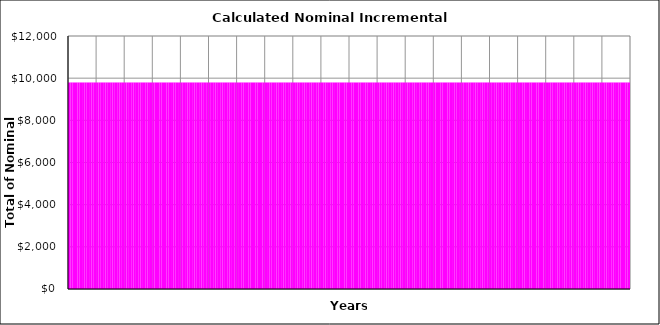
| Category | Stage (1) | Stage (2) | Stage (3) | Stage (4) | Stage (5) | Stage (6) | Stage (7) | Stage (8) | Stage (9) | Stage (10) |
|---|---|---|---|---|---|---|---|---|---|---|
| 0 | 9795.833 | 0 | 0 | 0 | 0 | 0 | 0 | 0 | 0 | 0 |
| 1 | 9795.833 | 0 | 0 | 0 | 0 | 0 | 0 | 0 | 0 | 0 |
| 2 | 9795.833 | 0 | 0 | 0 | 0 | 0 | 0 | 0 | 0 | 0 |
| 3 | 9795.833 | 0 | 0 | 0 | 0 | 0 | 0 | 0 | 0 | 0 |
| 4 | 9795.833 | 0 | 0 | 0 | 0 | 0 | 0 | 0 | 0 | 0 |
| 5 | 9795.833 | 0 | 0 | 0 | 0 | 0 | 0 | 0 | 0 | 0 |
| 6 | 9795.833 | 0 | 0 | 0 | 0 | 0 | 0 | 0 | 0 | 0 |
| 7 | 9795.833 | 0 | 0 | 0 | 0 | 0 | 0 | 0 | 0 | 0 |
| 8 | 9795.833 | 0 | 0 | 0 | 0 | 0 | 0 | 0 | 0 | 0 |
| 9 | 9795.833 | 0 | 0 | 0 | 0 | 0 | 0 | 0 | 0 | 0 |
| 10 | 9795.833 | 0 | 0 | 0 | 0 | 0 | 0 | 0 | 0 | 0 |
| 11 | 9795.833 | 0 | 0 | 0 | 0 | 0 | 0 | 0 | 0 | 0 |
| 12 | 9795.833 | 0 | 0 | 0 | 0 | 0 | 0 | 0 | 0 | 0 |
| 13 | 9795.833 | 0 | 0 | 0 | 0 | 0 | 0 | 0 | 0 | 0 |
| 14 | 9795.833 | 0 | 0 | 0 | 0 | 0 | 0 | 0 | 0 | 0 |
| 15 | 9795.833 | 0 | 0 | 0 | 0 | 0 | 0 | 0 | 0 | 0 |
| 16 | 9795.833 | 0 | 0 | 0 | 0 | 0 | 0 | 0 | 0 | 0 |
| 17 | 9795.833 | 0 | 0 | 0 | 0 | 0 | 0 | 0 | 0 | 0 |
| 18 | 9795.833 | 0 | 0 | 0 | 0 | 0 | 0 | 0 | 0 | 0 |
| 19 | 9795.833 | 0 | 0 | 0 | 0 | 0 | 0 | 0 | 0 | 0 |
| 20 | 9795.833 | 0 | 0 | 0 | 0 | 0 | 0 | 0 | 0 | 0 |
| 21 | 9795.833 | 0 | 0 | 0 | 0 | 0 | 0 | 0 | 0 | 0 |
| 22 | 9795.833 | 0 | 0 | 0 | 0 | 0 | 0 | 0 | 0 | 0 |
| 23 | 9795.833 | 0 | 0 | 0 | 0 | 0 | 0 | 0 | 0 | 0 |
| 24 | 9795.833 | 0 | 0 | 0 | 0 | 0 | 0 | 0 | 0 | 0 |
| 25 | 9795.833 | 0 | 0 | 0 | 0 | 0 | 0 | 0 | 0 | 0 |
| 26 | 9795.833 | 0 | 0 | 0 | 0 | 0 | 0 | 0 | 0 | 0 |
| 27 | 9795.833 | 0 | 0 | 0 | 0 | 0 | 0 | 0 | 0 | 0 |
| 28 | 9795.833 | 0 | 0 | 0 | 0 | 0 | 0 | 0 | 0 | 0 |
| 29 | 9795.833 | 0 | 0 | 0 | 0 | 0 | 0 | 0 | 0 | 0 |
| 30 | 9795.833 | 0 | 0 | 0 | 0 | 0 | 0 | 0 | 0 | 0 |
| 31 | 9795.833 | 0 | 0 | 0 | 0 | 0 | 0 | 0 | 0 | 0 |
| 32 | 9795.833 | 0 | 0 | 0 | 0 | 0 | 0 | 0 | 0 | 0 |
| 33 | 9795.833 | 0 | 0 | 0 | 0 | 0 | 0 | 0 | 0 | 0 |
| 34 | 9795.833 | 0 | 0 | 0 | 0 | 0 | 0 | 0 | 0 | 0 |
| 35 | 9795.833 | 0 | 0 | 0 | 0 | 0 | 0 | 0 | 0 | 0 |
| 36 | 9795.833 | 0 | 0 | 0 | 0 | 0 | 0 | 0 | 0 | 0 |
| 37 | 9795.833 | 0 | 0 | 0 | 0 | 0 | 0 | 0 | 0 | 0 |
| 38 | 9795.833 | 0 | 0 | 0 | 0 | 0 | 0 | 0 | 0 | 0 |
| 39 | 9795.833 | 0 | 0 | 0 | 0 | 0 | 0 | 0 | 0 | 0 |
| 40 | 9795.833 | 0 | 0 | 0 | 0 | 0 | 0 | 0 | 0 | 0 |
| 41 | 9795.833 | 0 | 0 | 0 | 0 | 0 | 0 | 0 | 0 | 0 |
| 42 | 9795.833 | 0 | 0 | 0 | 0 | 0 | 0 | 0 | 0 | 0 |
| 43 | 9795.833 | 0 | 0 | 0 | 0 | 0 | 0 | 0 | 0 | 0 |
| 44 | 9795.833 | 0 | 0 | 0 | 0 | 0 | 0 | 0 | 0 | 0 |
| 45 | 9795.833 | 0 | 0 | 0 | 0 | 0 | 0 | 0 | 0 | 0 |
| 46 | 9795.833 | 0 | 0 | 0 | 0 | 0 | 0 | 0 | 0 | 0 |
| 47 | 9795.833 | 0 | 0 | 0 | 0 | 0 | 0 | 0 | 0 | 0 |
| 48 | 9795.833 | 0 | 0 | 0 | 0 | 0 | 0 | 0 | 0 | 0 |
| 49 | 9795.833 | 0 | 0 | 0 | 0 | 0 | 0 | 0 | 0 | 0 |
| 50 | 9795.833 | 0 | 0 | 0 | 0 | 0 | 0 | 0 | 0 | 0 |
| 51 | 9795.833 | 0 | 0 | 0 | 0 | 0 | 0 | 0 | 0 | 0 |
| 52 | 9795.833 | 0 | 0 | 0 | 0 | 0 | 0 | 0 | 0 | 0 |
| 53 | 9795.833 | 0 | 0 | 0 | 0 | 0 | 0 | 0 | 0 | 0 |
| 54 | 9795.833 | 0 | 0 | 0 | 0 | 0 | 0 | 0 | 0 | 0 |
| 55 | 9795.833 | 0 | 0 | 0 | 0 | 0 | 0 | 0 | 0 | 0 |
| 56 | 9795.833 | 0 | 0 | 0 | 0 | 0 | 0 | 0 | 0 | 0 |
| 57 | 9795.833 | 0 | 0 | 0 | 0 | 0 | 0 | 0 | 0 | 0 |
| 58 | 9795.833 | 0 | 0 | 0 | 0 | 0 | 0 | 0 | 0 | 0 |
| 59 | 9795.833 | 0 | 0 | 0 | 0 | 0 | 0 | 0 | 0 | 0 |
| 60 | 9795.833 | 0 | 0 | 0 | 0 | 0 | 0 | 0 | 0 | 0 |
| 61 | 9795.833 | 0 | 0 | 0 | 0 | 0 | 0 | 0 | 0 | 0 |
| 62 | 9795.833 | 0 | 0 | 0 | 0 | 0 | 0 | 0 | 0 | 0 |
| 63 | 9795.833 | 0 | 0 | 0 | 0 | 0 | 0 | 0 | 0 | 0 |
| 64 | 9795.833 | 0 | 0 | 0 | 0 | 0 | 0 | 0 | 0 | 0 |
| 65 | 9795.833 | 0 | 0 | 0 | 0 | 0 | 0 | 0 | 0 | 0 |
| 66 | 9795.833 | 0 | 0 | 0 | 0 | 0 | 0 | 0 | 0 | 0 |
| 67 | 9795.833 | 0 | 0 | 0 | 0 | 0 | 0 | 0 | 0 | 0 |
| 68 | 9795.833 | 0 | 0 | 0 | 0 | 0 | 0 | 0 | 0 | 0 |
| 69 | 9795.833 | 0 | 0 | 0 | 0 | 0 | 0 | 0 | 0 | 0 |
| 70 | 9795.833 | 0 | 0 | 0 | 0 | 0 | 0 | 0 | 0 | 0 |
| 71 | 9795.833 | 0 | 0 | 0 | 0 | 0 | 0 | 0 | 0 | 0 |
| 72 | 9795.833 | 0 | 0 | 0 | 0 | 0 | 0 | 0 | 0 | 0 |
| 73 | 9795.833 | 0 | 0 | 0 | 0 | 0 | 0 | 0 | 0 | 0 |
| 74 | 9795.833 | 0 | 0 | 0 | 0 | 0 | 0 | 0 | 0 | 0 |
| 75 | 9795.833 | 0 | 0 | 0 | 0 | 0 | 0 | 0 | 0 | 0 |
| 76 | 9795.833 | 0 | 0 | 0 | 0 | 0 | 0 | 0 | 0 | 0 |
| 77 | 9795.833 | 0 | 0 | 0 | 0 | 0 | 0 | 0 | 0 | 0 |
| 78 | 9795.833 | 0 | 0 | 0 | 0 | 0 | 0 | 0 | 0 | 0 |
| 79 | 9795.833 | 0 | 0 | 0 | 0 | 0 | 0 | 0 | 0 | 0 |
| 80 | 9795.833 | 0 | 0 | 0 | 0 | 0 | 0 | 0 | 0 | 0 |
| 81 | 9795.833 | 0 | 0 | 0 | 0 | 0 | 0 | 0 | 0 | 0 |
| 82 | 9795.833 | 0 | 0 | 0 | 0 | 0 | 0 | 0 | 0 | 0 |
| 83 | 9795.833 | 0 | 0 | 0 | 0 | 0 | 0 | 0 | 0 | 0 |
| 84 | 9795.833 | 0 | 0 | 0 | 0 | 0 | 0 | 0 | 0 | 0 |
| 85 | 9795.833 | 0 | 0 | 0 | 0 | 0 | 0 | 0 | 0 | 0 |
| 86 | 9795.833 | 0 | 0 | 0 | 0 | 0 | 0 | 0 | 0 | 0 |
| 87 | 9795.833 | 0 | 0 | 0 | 0 | 0 | 0 | 0 | 0 | 0 |
| 88 | 9795.833 | 0 | 0 | 0 | 0 | 0 | 0 | 0 | 0 | 0 |
| 89 | 9795.833 | 0 | 0 | 0 | 0 | 0 | 0 | 0 | 0 | 0 |
| 90 | 9795.833 | 0 | 0 | 0 | 0 | 0 | 0 | 0 | 0 | 0 |
| 91 | 9795.833 | 0 | 0 | 0 | 0 | 0 | 0 | 0 | 0 | 0 |
| 92 | 9795.833 | 0 | 0 | 0 | 0 | 0 | 0 | 0 | 0 | 0 |
| 93 | 9795.833 | 0 | 0 | 0 | 0 | 0 | 0 | 0 | 0 | 0 |
| 94 | 9795.833 | 0 | 0 | 0 | 0 | 0 | 0 | 0 | 0 | 0 |
| 95 | 9795.833 | 0 | 0 | 0 | 0 | 0 | 0 | 0 | 0 | 0 |
| 96 | 9795.833 | 0 | 0 | 0 | 0 | 0 | 0 | 0 | 0 | 0 |
| 97 | 9795.833 | 0 | 0 | 0 | 0 | 0 | 0 | 0 | 0 | 0 |
| 98 | 9795.833 | 0 | 0 | 0 | 0 | 0 | 0 | 0 | 0 | 0 |
| 99 | 9795.833 | 0 | 0 | 0 | 0 | 0 | 0 | 0 | 0 | 0 |
| 100 | 9795.833 | 0 | 0 | 0 | 0 | 0 | 0 | 0 | 0 | 0 |
| 101 | 9795.833 | 0 | 0 | 0 | 0 | 0 | 0 | 0 | 0 | 0 |
| 102 | 9795.833 | 0 | 0 | 0 | 0 | 0 | 0 | 0 | 0 | 0 |
| 103 | 9795.833 | 0 | 0 | 0 | 0 | 0 | 0 | 0 | 0 | 0 |
| 104 | 9795.833 | 0 | 0 | 0 | 0 | 0 | 0 | 0 | 0 | 0 |
| 105 | 9795.833 | 0 | 0 | 0 | 0 | 0 | 0 | 0 | 0 | 0 |
| 106 | 9795.833 | 0 | 0 | 0 | 0 | 0 | 0 | 0 | 0 | 0 |
| 107 | 9795.833 | 0 | 0 | 0 | 0 | 0 | 0 | 0 | 0 | 0 |
| 108 | 9795.833 | 0 | 0 | 0 | 0 | 0 | 0 | 0 | 0 | 0 |
| 109 | 9795.833 | 0 | 0 | 0 | 0 | 0 | 0 | 0 | 0 | 0 |
| 110 | 9795.833 | 0 | 0 | 0 | 0 | 0 | 0 | 0 | 0 | 0 |
| 111 | 9795.833 | 0 | 0 | 0 | 0 | 0 | 0 | 0 | 0 | 0 |
| 112 | 9795.833 | 0 | 0 | 0 | 0 | 0 | 0 | 0 | 0 | 0 |
| 113 | 9795.833 | 0 | 0 | 0 | 0 | 0 | 0 | 0 | 0 | 0 |
| 114 | 9795.833 | 0 | 0 | 0 | 0 | 0 | 0 | 0 | 0 | 0 |
| 115 | 9795.833 | 0 | 0 | 0 | 0 | 0 | 0 | 0 | 0 | 0 |
| 116 | 9795.833 | 0 | 0 | 0 | 0 | 0 | 0 | 0 | 0 | 0 |
| 117 | 9795.833 | 0 | 0 | 0 | 0 | 0 | 0 | 0 | 0 | 0 |
| 118 | 9795.833 | 0 | 0 | 0 | 0 | 0 | 0 | 0 | 0 | 0 |
| 119 | 9795.833 | 0 | 0 | 0 | 0 | 0 | 0 | 0 | 0 | 0 |
| 120 | 9795.833 | 0 | 0 | 0 | 0 | 0 | 0 | 0 | 0 | 0 |
| 121 | 9795.833 | 0 | 0 | 0 | 0 | 0 | 0 | 0 | 0 | 0 |
| 122 | 9795.833 | 0 | 0 | 0 | 0 | 0 | 0 | 0 | 0 | 0 |
| 123 | 9795.833 | 0 | 0 | 0 | 0 | 0 | 0 | 0 | 0 | 0 |
| 124 | 9795.833 | 0 | 0 | 0 | 0 | 0 | 0 | 0 | 0 | 0 |
| 125 | 9795.833 | 0 | 0 | 0 | 0 | 0 | 0 | 0 | 0 | 0 |
| 126 | 9795.833 | 0 | 0 | 0 | 0 | 0 | 0 | 0 | 0 | 0 |
| 127 | 9795.833 | 0 | 0 | 0 | 0 | 0 | 0 | 0 | 0 | 0 |
| 128 | 9795.833 | 0 | 0 | 0 | 0 | 0 | 0 | 0 | 0 | 0 |
| 129 | 9795.833 | 0 | 0 | 0 | 0 | 0 | 0 | 0 | 0 | 0 |
| 130 | 9795.833 | 0 | 0 | 0 | 0 | 0 | 0 | 0 | 0 | 0 |
| 131 | 9795.833 | 0 | 0 | 0 | 0 | 0 | 0 | 0 | 0 | 0 |
| 132 | 9795.833 | 0 | 0 | 0 | 0 | 0 | 0 | 0 | 0 | 0 |
| 133 | 9795.833 | 0 | 0 | 0 | 0 | 0 | 0 | 0 | 0 | 0 |
| 134 | 9795.833 | 0 | 0 | 0 | 0 | 0 | 0 | 0 | 0 | 0 |
| 135 | 9795.833 | 0 | 0 | 0 | 0 | 0 | 0 | 0 | 0 | 0 |
| 136 | 9795.833 | 0 | 0 | 0 | 0 | 0 | 0 | 0 | 0 | 0 |
| 137 | 9795.833 | 0 | 0 | 0 | 0 | 0 | 0 | 0 | 0 | 0 |
| 138 | 9795.833 | 0 | 0 | 0 | 0 | 0 | 0 | 0 | 0 | 0 |
| 139 | 9795.833 | 0 | 0 | 0 | 0 | 0 | 0 | 0 | 0 | 0 |
| 140 | 9795.833 | 0 | 0 | 0 | 0 | 0 | 0 | 0 | 0 | 0 |
| 141 | 9795.833 | 0 | 0 | 0 | 0 | 0 | 0 | 0 | 0 | 0 |
| 142 | 9795.833 | 0 | 0 | 0 | 0 | 0 | 0 | 0 | 0 | 0 |
| 143 | 9795.833 | 0 | 0 | 0 | 0 | 0 | 0 | 0 | 0 | 0 |
| 144 | 9795.833 | 0 | 0 | 0 | 0 | 0 | 0 | 0 | 0 | 0 |
| 145 | 9795.833 | 0 | 0 | 0 | 0 | 0 | 0 | 0 | 0 | 0 |
| 146 | 9795.833 | 0 | 0 | 0 | 0 | 0 | 0 | 0 | 0 | 0 |
| 147 | 9795.833 | 0 | 0 | 0 | 0 | 0 | 0 | 0 | 0 | 0 |
| 148 | 9795.833 | 0 | 0 | 0 | 0 | 0 | 0 | 0 | 0 | 0 |
| 149 | 9795.833 | 0 | 0 | 0 | 0 | 0 | 0 | 0 | 0 | 0 |
| 150 | 9795.833 | 0 | 0 | 0 | 0 | 0 | 0 | 0 | 0 | 0 |
| 151 | 9795.833 | 0 | 0 | 0 | 0 | 0 | 0 | 0 | 0 | 0 |
| 152 | 9795.833 | 0 | 0 | 0 | 0 | 0 | 0 | 0 | 0 | 0 |
| 153 | 9795.833 | 0 | 0 | 0 | 0 | 0 | 0 | 0 | 0 | 0 |
| 154 | 9795.833 | 0 | 0 | 0 | 0 | 0 | 0 | 0 | 0 | 0 |
| 155 | 9795.833 | 0 | 0 | 0 | 0 | 0 | 0 | 0 | 0 | 0 |
| 156 | 9795.833 | 0 | 0 | 0 | 0 | 0 | 0 | 0 | 0 | 0 |
| 157 | 9795.833 | 0 | 0 | 0 | 0 | 0 | 0 | 0 | 0 | 0 |
| 158 | 9795.833 | 0 | 0 | 0 | 0 | 0 | 0 | 0 | 0 | 0 |
| 159 | 9795.833 | 0 | 0 | 0 | 0 | 0 | 0 | 0 | 0 | 0 |
| 160 | 9795.833 | 0 | 0 | 0 | 0 | 0 | 0 | 0 | 0 | 0 |
| 161 | 9795.833 | 0 | 0 | 0 | 0 | 0 | 0 | 0 | 0 | 0 |
| 162 | 9795.833 | 0 | 0 | 0 | 0 | 0 | 0 | 0 | 0 | 0 |
| 163 | 9795.833 | 0 | 0 | 0 | 0 | 0 | 0 | 0 | 0 | 0 |
| 164 | 9795.833 | 0 | 0 | 0 | 0 | 0 | 0 | 0 | 0 | 0 |
| 165 | 9795.833 | 0 | 0 | 0 | 0 | 0 | 0 | 0 | 0 | 0 |
| 166 | 9795.833 | 0 | 0 | 0 | 0 | 0 | 0 | 0 | 0 | 0 |
| 167 | 9795.833 | 0 | 0 | 0 | 0 | 0 | 0 | 0 | 0 | 0 |
| 168 | 9795.833 | 0 | 0 | 0 | 0 | 0 | 0 | 0 | 0 | 0 |
| 169 | 9795.833 | 0 | 0 | 0 | 0 | 0 | 0 | 0 | 0 | 0 |
| 170 | 9795.833 | 0 | 0 | 0 | 0 | 0 | 0 | 0 | 0 | 0 |
| 171 | 9795.833 | 0 | 0 | 0 | 0 | 0 | 0 | 0 | 0 | 0 |
| 172 | 9795.833 | 0 | 0 | 0 | 0 | 0 | 0 | 0 | 0 | 0 |
| 173 | 9795.833 | 0 | 0 | 0 | 0 | 0 | 0 | 0 | 0 | 0 |
| 174 | 9795.833 | 0 | 0 | 0 | 0 | 0 | 0 | 0 | 0 | 0 |
| 175 | 9795.833 | 0 | 0 | 0 | 0 | 0 | 0 | 0 | 0 | 0 |
| 176 | 9795.833 | 0 | 0 | 0 | 0 | 0 | 0 | 0 | 0 | 0 |
| 177 | 9795.833 | 0 | 0 | 0 | 0 | 0 | 0 | 0 | 0 | 0 |
| 178 | 9795.833 | 0 | 0 | 0 | 0 | 0 | 0 | 0 | 0 | 0 |
| 179 | 9795.833 | 0 | 0 | 0 | 0 | 0 | 0 | 0 | 0 | 0 |
| 180 | 9795.833 | 0 | 0 | 0 | 0 | 0 | 0 | 0 | 0 | 0 |
| 181 | 9795.833 | 0 | 0 | 0 | 0 | 0 | 0 | 0 | 0 | 0 |
| 182 | 9795.833 | 0 | 0 | 0 | 0 | 0 | 0 | 0 | 0 | 0 |
| 183 | 9795.833 | 0 | 0 | 0 | 0 | 0 | 0 | 0 | 0 | 0 |
| 184 | 9795.833 | 0 | 0 | 0 | 0 | 0 | 0 | 0 | 0 | 0 |
| 185 | 9795.833 | 0 | 0 | 0 | 0 | 0 | 0 | 0 | 0 | 0 |
| 186 | 9795.833 | 0 | 0 | 0 | 0 | 0 | 0 | 0 | 0 | 0 |
| 187 | 9795.833 | 0 | 0 | 0 | 0 | 0 | 0 | 0 | 0 | 0 |
| 188 | 9795.833 | 0 | 0 | 0 | 0 | 0 | 0 | 0 | 0 | 0 |
| 189 | 9795.833 | 0 | 0 | 0 | 0 | 0 | 0 | 0 | 0 | 0 |
| 190 | 9795.833 | 0 | 0 | 0 | 0 | 0 | 0 | 0 | 0 | 0 |
| 191 | 9795.833 | 0 | 0 | 0 | 0 | 0 | 0 | 0 | 0 | 0 |
| 192 | 9795.833 | 0 | 0 | 0 | 0 | 0 | 0 | 0 | 0 | 0 |
| 193 | 9795.833 | 0 | 0 | 0 | 0 | 0 | 0 | 0 | 0 | 0 |
| 194 | 9795.833 | 0 | 0 | 0 | 0 | 0 | 0 | 0 | 0 | 0 |
| 195 | 9795.833 | 0 | 0 | 0 | 0 | 0 | 0 | 0 | 0 | 0 |
| 196 | 9795.833 | 0 | 0 | 0 | 0 | 0 | 0 | 0 | 0 | 0 |
| 197 | 9795.833 | 0 | 0 | 0 | 0 | 0 | 0 | 0 | 0 | 0 |
| 198 | 9795.833 | 0 | 0 | 0 | 0 | 0 | 0 | 0 | 0 | 0 |
| 199 | 9795.833 | 0 | 0 | 0 | 0 | 0 | 0 | 0 | 0 | 0 |
| 200 | 9795.833 | 0 | 0 | 0 | 0 | 0 | 0 | 0 | 0 | 0 |
| 201 | 9795.833 | 0 | 0 | 0 | 0 | 0 | 0 | 0 | 0 | 0 |
| 202 | 9795.833 | 0 | 0 | 0 | 0 | 0 | 0 | 0 | 0 | 0 |
| 203 | 9795.833 | 0 | 0 | 0 | 0 | 0 | 0 | 0 | 0 | 0 |
| 204 | 9795.833 | 0 | 0 | 0 | 0 | 0 | 0 | 0 | 0 | 0 |
| 205 | 9795.833 | 0 | 0 | 0 | 0 | 0 | 0 | 0 | 0 | 0 |
| 206 | 9795.833 | 0 | 0 | 0 | 0 | 0 | 0 | 0 | 0 | 0 |
| 207 | 9795.833 | 0 | 0 | 0 | 0 | 0 | 0 | 0 | 0 | 0 |
| 208 | 9795.833 | 0 | 0 | 0 | 0 | 0 | 0 | 0 | 0 | 0 |
| 209 | 9795.833 | 0 | 0 | 0 | 0 | 0 | 0 | 0 | 0 | 0 |
| 210 | 9795.833 | 0 | 0 | 0 | 0 | 0 | 0 | 0 | 0 | 0 |
| 211 | 9795.833 | 0 | 0 | 0 | 0 | 0 | 0 | 0 | 0 | 0 |
| 212 | 9795.833 | 0 | 0 | 0 | 0 | 0 | 0 | 0 | 0 | 0 |
| 213 | 9795.833 | 0 | 0 | 0 | 0 | 0 | 0 | 0 | 0 | 0 |
| 214 | 9795.833 | 0 | 0 | 0 | 0 | 0 | 0 | 0 | 0 | 0 |
| 215 | 9795.833 | 0 | 0 | 0 | 0 | 0 | 0 | 0 | 0 | 0 |
| 216 | 9795.833 | 0 | 0 | 0 | 0 | 0 | 0 | 0 | 0 | 0 |
| 217 | 9795.833 | 0 | 0 | 0 | 0 | 0 | 0 | 0 | 0 | 0 |
| 218 | 9795.833 | 0 | 0 | 0 | 0 | 0 | 0 | 0 | 0 | 0 |
| 219 | 9795.833 | 0 | 0 | 0 | 0 | 0 | 0 | 0 | 0 | 0 |
| 220 | 9795.833 | 0 | 0 | 0 | 0 | 0 | 0 | 0 | 0 | 0 |
| 221 | 9795.833 | 0 | 0 | 0 | 0 | 0 | 0 | 0 | 0 | 0 |
| 222 | 9795.833 | 0 | 0 | 0 | 0 | 0 | 0 | 0 | 0 | 0 |
| 223 | 9795.833 | 0 | 0 | 0 | 0 | 0 | 0 | 0 | 0 | 0 |
| 224 | 9795.833 | 0 | 0 | 0 | 0 | 0 | 0 | 0 | 0 | 0 |
| 225 | 9795.833 | 0 | 0 | 0 | 0 | 0 | 0 | 0 | 0 | 0 |
| 226 | 9795.833 | 0 | 0 | 0 | 0 | 0 | 0 | 0 | 0 | 0 |
| 227 | 9795.833 | 0 | 0 | 0 | 0 | 0 | 0 | 0 | 0 | 0 |
| 228 | 9795.833 | 0 | 0 | 0 | 0 | 0 | 0 | 0 | 0 | 0 |
| 229 | 9795.833 | 0 | 0 | 0 | 0 | 0 | 0 | 0 | 0 | 0 |
| 230 | 9795.833 | 0 | 0 | 0 | 0 | 0 | 0 | 0 | 0 | 0 |
| 231 | 9795.833 | 0 | 0 | 0 | 0 | 0 | 0 | 0 | 0 | 0 |
| 232 | 9795.833 | 0 | 0 | 0 | 0 | 0 | 0 | 0 | 0 | 0 |
| 233 | 9795.833 | 0 | 0 | 0 | 0 | 0 | 0 | 0 | 0 | 0 |
| 234 | 9795.833 | 0 | 0 | 0 | 0 | 0 | 0 | 0 | 0 | 0 |
| 235 | 9795.833 | 0 | 0 | 0 | 0 | 0 | 0 | 0 | 0 | 0 |
| 236 | 9795.833 | 0 | 0 | 0 | 0 | 0 | 0 | 0 | 0 | 0 |
| 237 | 9795.833 | 0 | 0 | 0 | 0 | 0 | 0 | 0 | 0 | 0 |
| 238 | 9795.833 | 0 | 0 | 0 | 0 | 0 | 0 | 0 | 0 | 0 |
| 239 | 9795.833 | 0 | 0 | 0 | 0 | 0 | 0 | 0 | 0 | 0 |